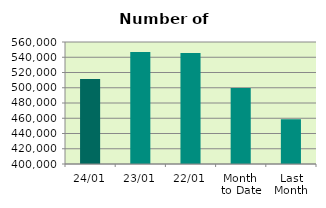
| Category | Series 0 |
|---|---|
| 24/01 | 511538 |
| 23/01 | 547034 |
| 22/01 | 545690 |
| Month 
to Date | 499826.471 |
| Last
Month | 458836.4 |